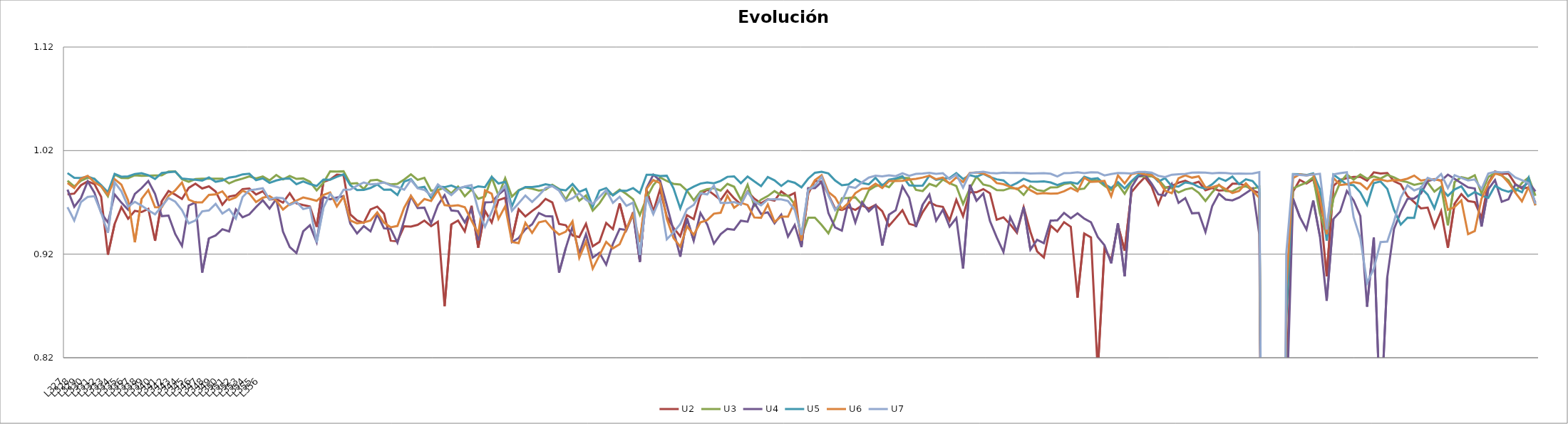
| Category | U2 | U3 | U4 | U5 | U6 | U7 |
|---|---|---|---|---|---|---|
| L327 | 0.978 | 0.991 | 0.982 | 0.998 | 0.989 | 0.965 |
| L328 | 0.978 | 0.985 | 0.966 | 0.994 | 0.984 | 0.952 |
| L329 | 0.987 | 0.991 | 0.974 | 0.994 | 0.993 | 0.97 |
| L330 | 0.99 | 0.994 | 0.99 | 0.995 | 0.996 | 0.975 |
| L331 | 0.988 | 0.993 | 0.979 | 0.993 | 0.989 | 0.976 |
| L332 | 0.975 | 0.985 | 0.96 | 0.987 | 0.986 | 0.96 |
| L333 | 0.92 | 0.976 | 0.951 | 0.98 | 0.977 | 0.941 |
| L334 | 0.949 | 0.997 | 0.978 | 0.998 | 0.992 | 0.989 |
| L335 | 0.965 | 0.993 | 0.97 | 0.995 | 0.987 | 0.981 |
| L336 | 0.954 | 0.993 | 0.963 | 0.995 | 0.972 | 0.966 |
| L337 | 0.962 | 0.996 | 0.978 | 0.997 | 0.931 | 0.97 |
| L338 | 0.961 | 0.996 | 0.984 | 0.998 | 0.973 | 0.967 |
| L339 | 0.964 | 0.996 | 0.991 | 0.996 | 0.982 | 0.962 |
| L340 | 0.933 | 0.996 | 0.978 | 0.993 | 0.965 | 0.959 |
| L341 | 0.971 | 0.996 | 0.957 | 0.998 | 0.965 | 0.966 |
| L342 | 0.981 | 1 | 0.957 | 0.999 | 0.976 | 0.974 |
| L343 | 0.977 | 1 | 0.939 | 1 | 0.982 | 0.971 |
| L344 | 0.973 | 0.992 | 0.928 | 0.993 | 0.989 | 0.963 |
| L345 | 0.984 | 0.99 | 0.967 | 0.992 | 0.973 | 0.95 |
| L346 | 0.988 | 0.993 | 0.97 | 0.992 | 0.97 | 0.953 |
| L347 | 0.983 | 0.993 | 0.902 | 0.991 | 0.97 | 0.961 |
| L348 | 0.985 | 0.993 | 0.935 | 0.994 | 0.977 | 0.962 |
| L349 | 0.981 | 0.993 | 0.938 | 0.99 | 0.978 | 0.969 |
| L350 | 0.968 | 0.993 | 0.944 | 0.991 | 0.981 | 0.959 |
| L351 | 0.976 | 0.988 | 0.942 | 0.994 | 0.972 | 0.963 |
| L352 | 0.977 | 0.991 | 0.963 | 0.995 | 0.975 | 0.954 |
| L353 | 0.983 | 0.993 | 0.956 | 0.997 | 0.981 | 0.975 |
| L354 | 0.983 | 0.995 | 0.958 | 0.998 | 0.978 | 0.982 |
| L355 | 0.978 | 0.993 | 0.966 | 0.991 | 0.97 | 0.983 |
| L356 | 0.981 | 0.995 | 0.972 | 0.993 | 0.975 | 0.984 |